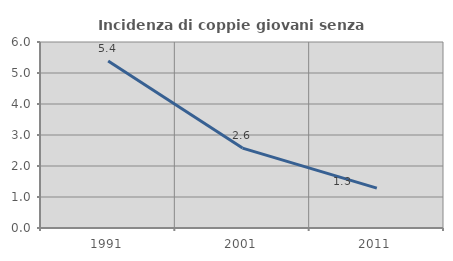
| Category | Incidenza di coppie giovani senza figli |
|---|---|
| 1991.0 | 5.383 |
| 2001.0 | 2.577 |
| 2011.0 | 1.287 |